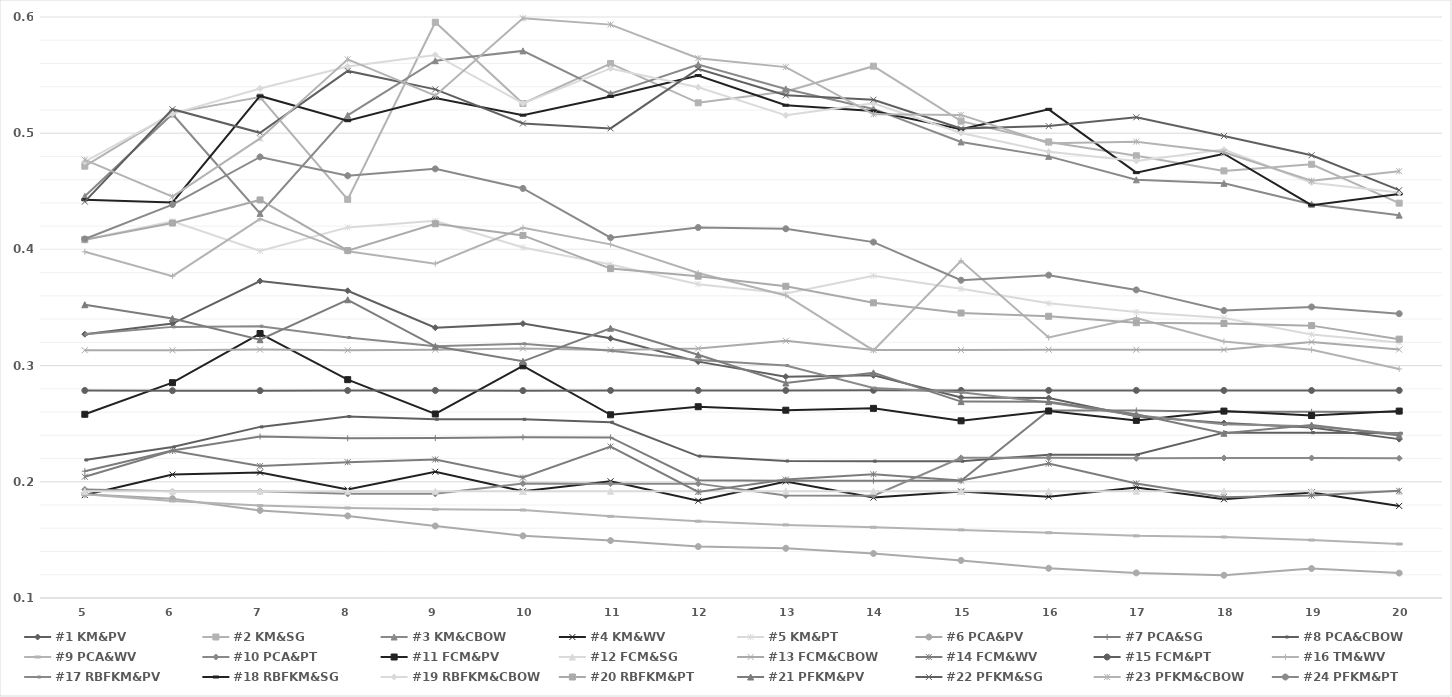
| Category | #1 KM&PV | #2 KM&SG | #3 KM&CBOW | #4 KM&WV | #5 KM&PT | #6 PCA&PV | #7 PCA&SG | #8 PCA&CBOW | #9 PCA&WV | #10 PCA&PT | #11 FCM&PV | #12 FCM&SG | #13 FCM&CBOW | #14 FCM&WV | #15 FCM&PT | #16 TM&WV | #17 RBFKM&PV | #18 RBFKM&SG | #19 RBFKM&CBOW | #20 RBFKM&PT | #21 PFKM&PV | #22 PFKM&SG | #23 PFKM&CBOW | #24 PFKM&PT |
|---|---|---|---|---|---|---|---|---|---|---|---|---|---|---|---|---|---|---|---|---|---|---|---|---|
| 5.0 | 0.327 | 0.472 | 0.446 | 0.189 | 0.408 | 0.189 | 0.209 | 0.219 | 0.189 | 0.193 | 0.258 | 0.192 | 0.313 | 0.204 | 0.279 | 0.398 | 0.327 | 0.443 | 0.475 | 0.408 | 0.352 | 0.441 | 0.477 | 0.409 |
| 6.0 | 0.336 | 0.518 | 0.517 | 0.206 | 0.424 | 0.186 | 0.227 | 0.23 | 0.183 | 0.192 | 0.285 | 0.192 | 0.313 | 0.227 | 0.278 | 0.377 | 0.333 | 0.44 | 0.517 | 0.423 | 0.341 | 0.521 | 0.445 | 0.439 |
| 7.0 | 0.373 | 0.531 | 0.431 | 0.208 | 0.399 | 0.175 | 0.239 | 0.247 | 0.18 | 0.192 | 0.328 | 0.192 | 0.314 | 0.214 | 0.278 | 0.426 | 0.334 | 0.532 | 0.539 | 0.443 | 0.322 | 0.5 | 0.496 | 0.48 |
| 8.0 | 0.364 | 0.443 | 0.515 | 0.193 | 0.419 | 0.171 | 0.237 | 0.256 | 0.177 | 0.19 | 0.288 | 0.192 | 0.313 | 0.217 | 0.279 | 0.398 | 0.324 | 0.511 | 0.557 | 0.399 | 0.357 | 0.554 | 0.564 | 0.463 |
| 9.0 | 0.333 | 0.595 | 0.562 | 0.209 | 0.425 | 0.162 | 0.238 | 0.254 | 0.176 | 0.19 | 0.258 | 0.192 | 0.314 | 0.219 | 0.279 | 0.388 | 0.317 | 0.53 | 0.567 | 0.422 | 0.317 | 0.538 | 0.532 | 0.469 |
| 10.0 | 0.336 | 0.526 | 0.571 | 0.192 | 0.402 | 0.153 | 0.238 | 0.254 | 0.176 | 0.198 | 0.3 | 0.192 | 0.315 | 0.204 | 0.278 | 0.419 | 0.319 | 0.516 | 0.526 | 0.412 | 0.304 | 0.508 | 0.599 | 0.452 |
| 11.0 | 0.323 | 0.56 | 0.534 | 0.2 | 0.387 | 0.149 | 0.238 | 0.251 | 0.17 | 0.198 | 0.258 | 0.192 | 0.313 | 0.23 | 0.279 | 0.404 | 0.313 | 0.532 | 0.556 | 0.383 | 0.332 | 0.504 | 0.593 | 0.41 |
| 12.0 | 0.303 | 0.526 | 0.559 | 0.184 | 0.37 | 0.144 | 0.201 | 0.222 | 0.166 | 0.198 | 0.265 | 0.192 | 0.315 | 0.191 | 0.279 | 0.38 | 0.305 | 0.55 | 0.54 | 0.377 | 0.309 | 0.555 | 0.565 | 0.419 |
| 13.0 | 0.29 | 0.536 | 0.538 | 0.2 | 0.362 | 0.143 | 0.201 | 0.218 | 0.163 | 0.188 | 0.262 | 0.192 | 0.321 | 0.202 | 0.279 | 0.36 | 0.3 | 0.524 | 0.515 | 0.368 | 0.285 | 0.533 | 0.557 | 0.418 |
| 14.0 | 0.292 | 0.558 | 0.521 | 0.186 | 0.377 | 0.138 | 0.201 | 0.218 | 0.161 | 0.188 | 0.263 | 0.192 | 0.313 | 0.207 | 0.279 | 0.313 | 0.281 | 0.519 | 0.526 | 0.354 | 0.294 | 0.529 | 0.516 | 0.406 |
| 15.0 | 0.273 | 0.51 | 0.492 | 0.192 | 0.366 | 0.132 | 0.201 | 0.218 | 0.159 | 0.221 | 0.252 | 0.192 | 0.313 | 0.201 | 0.279 | 0.39 | 0.277 | 0.503 | 0.5 | 0.345 | 0.269 | 0.504 | 0.516 | 0.373 |
| 16.0 | 0.272 | 0.493 | 0.48 | 0.187 | 0.354 | 0.126 | 0.261 | 0.223 | 0.156 | 0.221 | 0.261 | 0.192 | 0.314 | 0.216 | 0.279 | 0.324 | 0.268 | 0.521 | 0.484 | 0.342 | 0.269 | 0.506 | 0.491 | 0.378 |
| 17.0 | 0.256 | 0.481 | 0.46 | 0.195 | 0.346 | 0.122 | 0.261 | 0.223 | 0.153 | 0.22 | 0.253 | 0.192 | 0.314 | 0.199 | 0.279 | 0.341 | 0.257 | 0.466 | 0.476 | 0.337 | 0.258 | 0.514 | 0.493 | 0.365 |
| 18.0 | 0.251 | 0.468 | 0.457 | 0.185 | 0.341 | 0.12 | 0.26 | 0.242 | 0.152 | 0.221 | 0.261 | 0.192 | 0.314 | 0.187 | 0.279 | 0.321 | 0.25 | 0.482 | 0.486 | 0.336 | 0.242 | 0.498 | 0.484 | 0.347 |
| 19.0 | 0.247 | 0.473 | 0.439 | 0.191 | 0.327 | 0.125 | 0.26 | 0.242 | 0.15 | 0.221 | 0.257 | 0.192 | 0.32 | 0.188 | 0.279 | 0.314 | 0.248 | 0.438 | 0.457 | 0.334 | 0.249 | 0.481 | 0.459 | 0.35 |
| 20.0 | 0.237 | 0.44 | 0.429 | 0.179 | 0.32 | 0.121 | 0.26 | 0.242 | 0.146 | 0.22 | 0.261 | 0.192 | 0.314 | 0.192 | 0.279 | 0.297 | 0.241 | 0.448 | 0.449 | 0.323 | 0.24 | 0.451 | 0.467 | 0.345 |